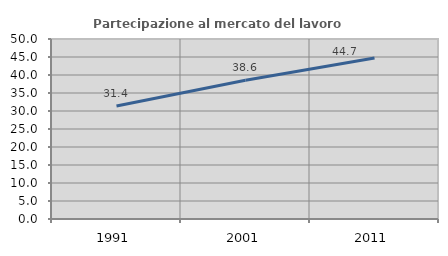
| Category | Partecipazione al mercato del lavoro  femminile |
|---|---|
| 1991.0 | 31.373 |
| 2001.0 | 38.568 |
| 2011.0 | 44.714 |